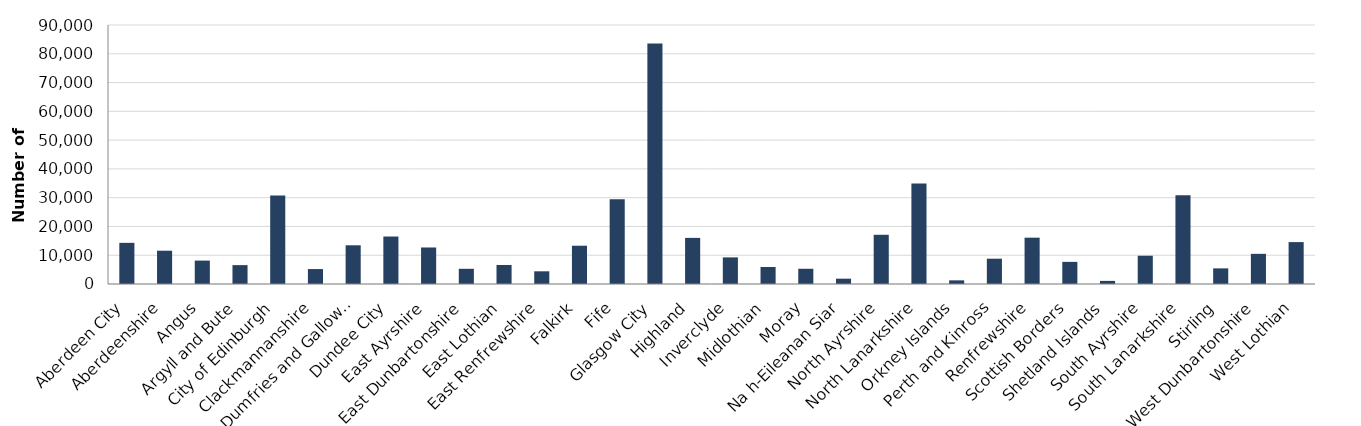
| Category | No. of CTR 
recipients |
|---|---|
| Aberdeen City | 14300 |
| Aberdeenshire | 11570 |
| Angus | 8130 |
| Argyll and Bute | 6560 |
| City of Edinburgh | 30790 |
| Clackmannanshire | 5190 |
| Dumfries and Galloway | 13450 |
| Dundee City | 16500 |
| East Ayrshire | 12690 |
| East Dunbartonshire | 5280 |
| East Lothian | 6610 |
| East Renfrewshire | 4410 |
| Falkirk | 13300 |
| Fife | 29490 |
| Glasgow City | 83590 |
| Highland | 16020 |
| Inverclyde | 9250 |
| Midlothian | 5910 |
| Moray | 5290 |
| Na h-Eileanan Siar | 1850 |
| North Ayrshire | 17100 |
| North Lanarkshire | 34950 |
| Orkney Islands | 1270 |
| Perth and Kinross | 8790 |
| Renfrewshire | 16100 |
| Scottish Borders | 7690 |
| Shetland Islands | 1080 |
| South Ayrshire | 9820 |
| South Lanarkshire | 30810 |
| Stirling | 5430 |
| West Dunbartonshire | 10480 |
| West Lothian | 14560 |